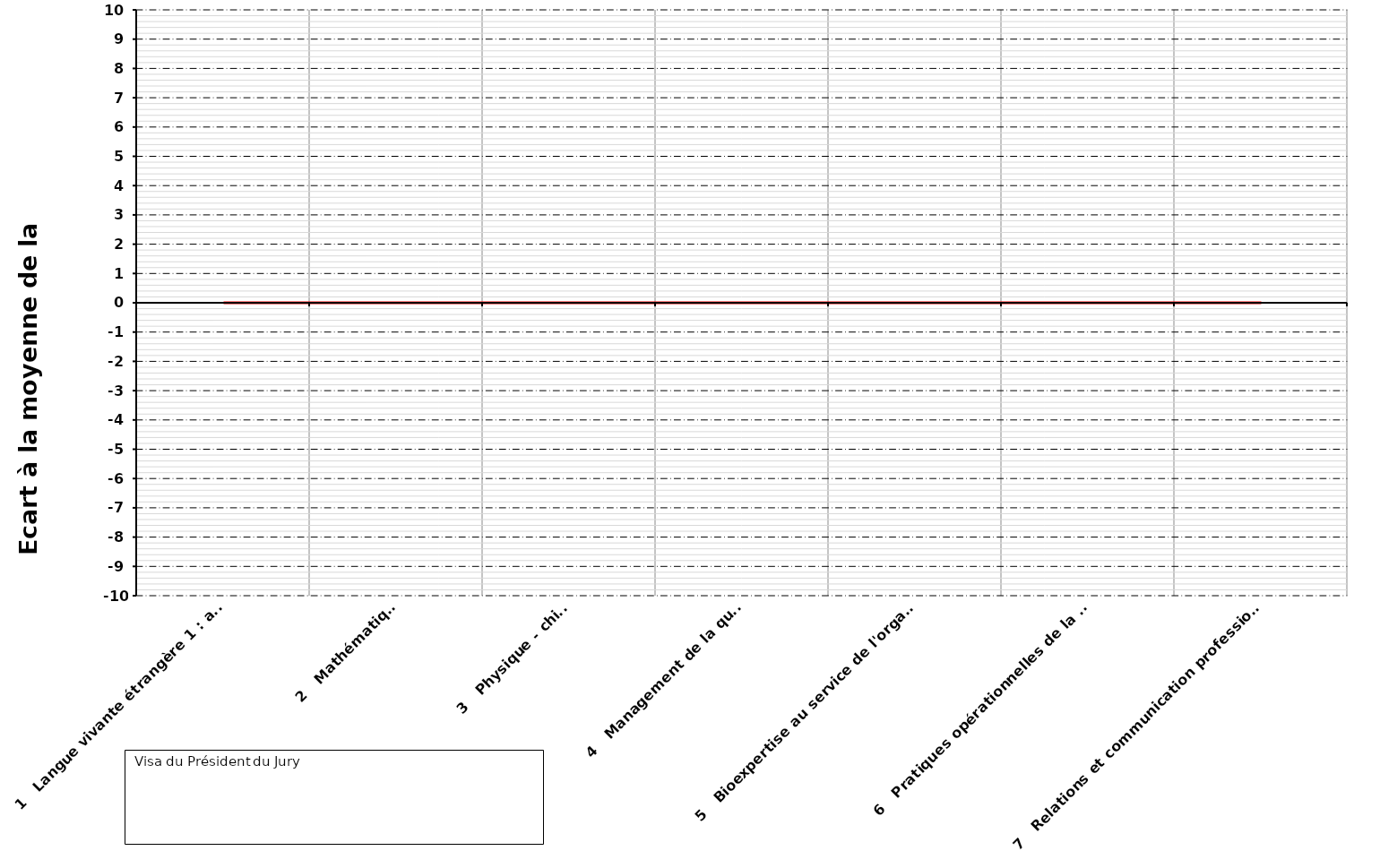
| Category | Series 2 |
|---|---|
|   1   Langue vivante étrangère 1 : anglais | 0 |
|   2   Mathématiques | 0 |
|   3   Physique - chimie | 0 |
|   4   Management de la qualité | 0 |
|   5   Bioexpertise au service de l'organisme | 0 |
|   6   Pratiques opérationnelles de la qualité | 0 |
|   7   Relations et communication professionnelles | 0 |